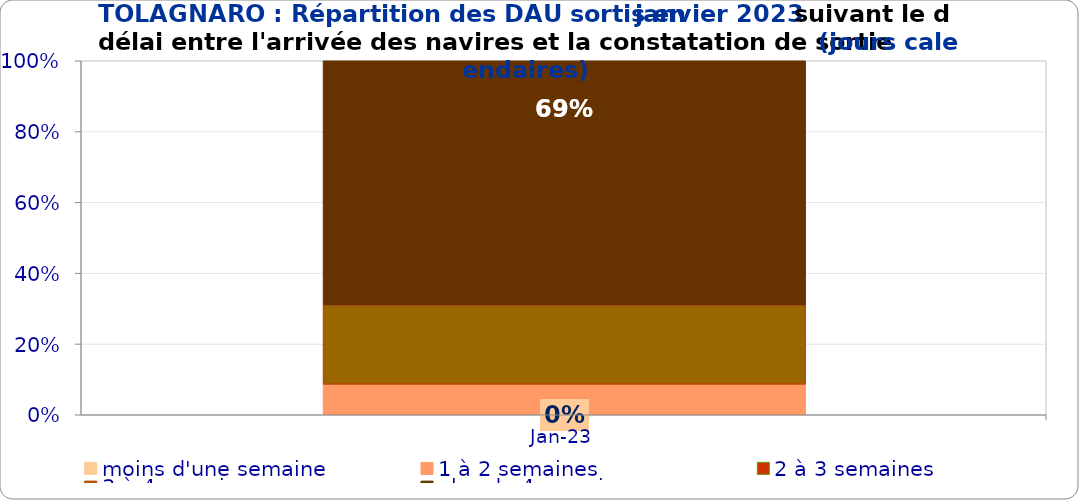
| Category | moins d'une semaine | 1 à 2 semaines | 2 à 3 semaines | 3 à 4 semaines | plus de 4 semaines |
|---|---|---|---|---|---|
| 2023-01-01 | 0 | 0.086 | 0 | 0.224 | 0.69 |